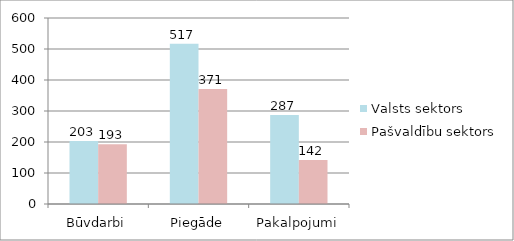
| Category | Valsts sektors | Pašvaldību sektors |
|---|---|---|
| Būvdarbi | 203 | 193 |
| Piegāde | 517 | 371 |
| Pakalpojumi | 287 | 142 |